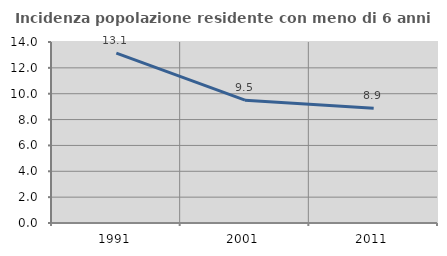
| Category | Incidenza popolazione residente con meno di 6 anni |
|---|---|
| 1991.0 | 13.133 |
| 2001.0 | 9.502 |
| 2011.0 | 8.874 |